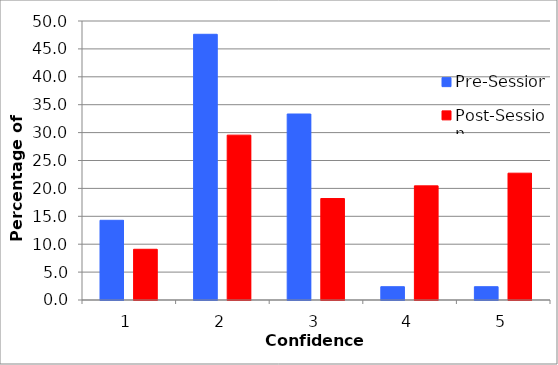
| Category | Pre-Session | Post-Session |
|---|---|---|
| 1.0 | 14.286 | 9.091 |
| 2.0 | 47.619 | 29.545 |
| 3.0 | 33.333 | 18.182 |
| 4.0 | 2.381 | 20.455 |
| 5.0 | 2.381 | 22.727 |